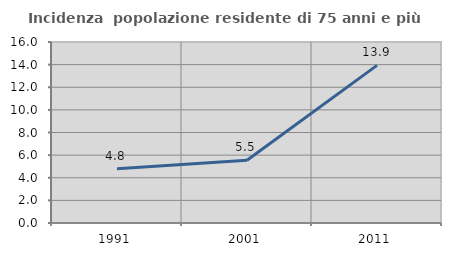
| Category | Incidenza  popolazione residente di 75 anni e più |
|---|---|
| 1991.0 | 4.788 |
| 2001.0 | 5.547 |
| 2011.0 | 13.933 |